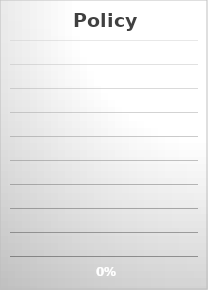
| Category | All Policies Approved: |
|---|---|
| 0 | 0 |